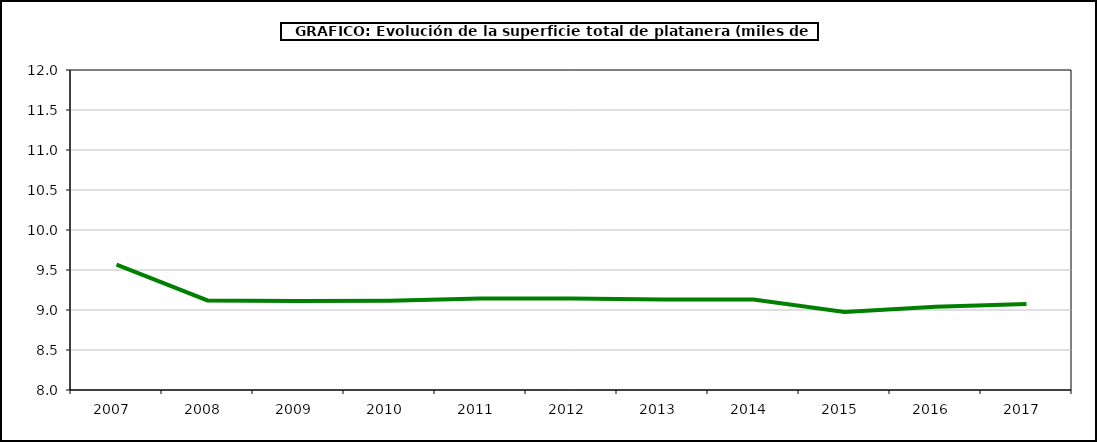
| Category | superficie platanera |
|---|---|
| 2007.0 | 9.568 |
| 2008.0 | 9.119 |
| 2009.0 | 9.113 |
| 2010.0 | 9.117 |
| 2011.0 | 9.144 |
| 2012.0 | 9.144 |
| 2013.0 | 9.131 |
| 2014.0 | 9.13 |
| 2015.0 | 8.975 |
| 2016.0 | 9.04 |
| 2017.0 | 9.076 |